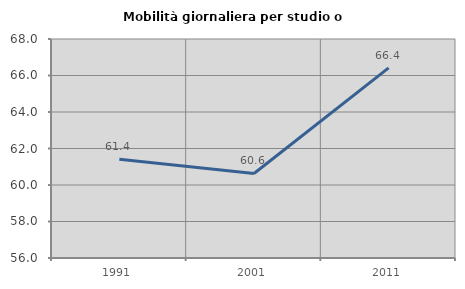
| Category | Mobilità giornaliera per studio o lavoro |
|---|---|
| 1991.0 | 61.405 |
| 2001.0 | 60.63 |
| 2011.0 | 66.415 |